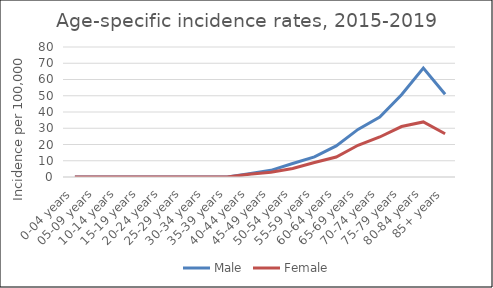
| Category | Male | Female |
|---|---|---|
| 0-04 years | 0 | 0 |
| 05-09 years | 0 | 0 |
| 10-14 years | 0 | 0 |
| 15-19 years | 0 | 0 |
| 20-24 years | 0 | 0 |
| 25-29 years | 0 | 0 |
| 30-34 years | 0 | 0 |
| 35-39 years | 0 | 0 |
| 40-44 years | 2.03 | 1.67 |
| 45-49 years | 4.1 | 2.92 |
| 50-54 years | 8.3 | 5.27 |
| 55-59 years | 12.34 | 8.88 |
| 60-64 years | 19.12 | 12.3 |
| 65-69 years | 29.28 | 19.54 |
| 70-74 years | 36.85 | 24.62 |
| 75-79 years | 50.63 | 31.06 |
| 80-84 years | 67.06 | 33.88 |
| 85+ years | 50.9 | 26.61 |